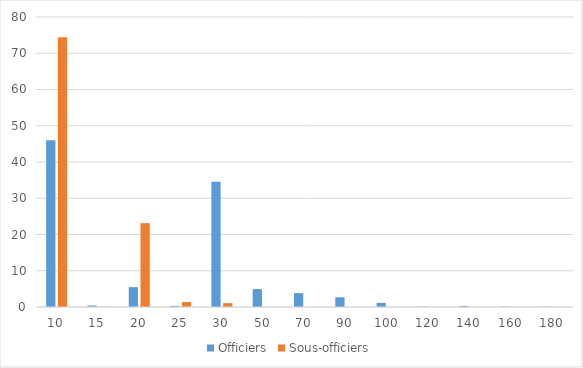
| Category | Officiers | Sous-officiers |
|---|---|---|
| 10.0 | 46.03 | 74.41 |
| 15.0 | 0.41 | 0.03 |
| 20.0 | 5.47 | 23.13 |
| 25.0 | 0.31 | 1.37 |
| 30.0 | 34.57 | 1.06 |
| 50.0 | 4.95 | 0 |
| 70.0 | 3.82 | 0 |
| 90.0 | 2.68 | 0 |
| 100.0 | 1.14 | 0 |
| 120.0 | 0.1 | 0 |
| 140.0 | 0.31 | 0 |
| 160.0 | 0.1 | 0 |
| 180.0 | 0.1 | 0 |